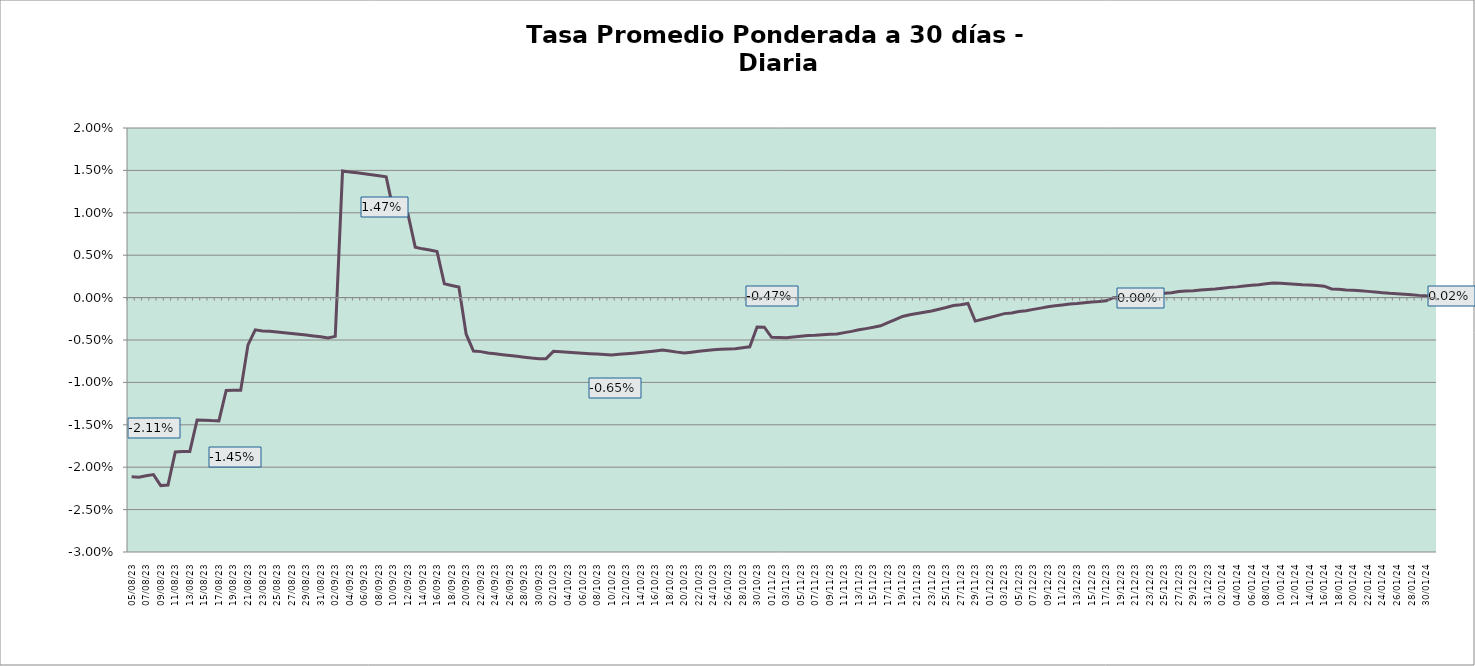
| Category | Tasa a 30 días |
|---|---|
| 2023-08-05 | -0.021 |
| 2023-08-06 | -0.021 |
| 2023-08-07 | -0.021 |
| 2023-08-08 | -0.021 |
| 2023-08-09 | -0.022 |
| 2023-08-10 | -0.022 |
| 2023-08-11 | -0.018 |
| 2023-08-12 | -0.018 |
| 2023-08-13 | -0.018 |
| 2023-08-14 | -0.014 |
| 2023-08-15 | -0.014 |
| 2023-08-16 | -0.015 |
| 2023-08-17 | -0.015 |
| 2023-08-18 | -0.011 |
| 2023-08-19 | -0.011 |
| 2023-08-20 | -0.011 |
| 2023-08-21 | -0.006 |
| 2023-08-22 | -0.004 |
| 2023-08-23 | -0.004 |
| 2023-08-24 | -0.004 |
| 2023-08-25 | -0.004 |
| 2023-08-26 | -0.004 |
| 2023-08-27 | -0.004 |
| 2023-08-28 | -0.004 |
| 2023-08-29 | -0.004 |
| 2023-08-30 | -0.005 |
| 2023-08-31 | -0.005 |
| 2023-09-01 | -0.005 |
| 2023-09-02 | -0.005 |
| 2023-09-03 | 0.015 |
| 2023-09-04 | 0.015 |
| 2023-09-05 | 0.015 |
| 2023-09-06 | 0.015 |
| 2023-09-07 | 0.014 |
| 2023-09-08 | 0.014 |
| 2023-09-09 | 0.014 |
| 2023-09-10 | 0.01 |
| 2023-09-11 | 0.01 |
| 2023-09-12 | 0.01 |
| 2023-09-13 | 0.006 |
| 2023-09-14 | 0.006 |
| 2023-09-15 | 0.006 |
| 2023-09-16 | 0.005 |
| 2023-09-17 | 0.002 |
| 2023-09-18 | 0.001 |
| 2023-09-19 | 0.001 |
| 2023-09-20 | -0.004 |
| 2023-09-21 | -0.006 |
| 2023-09-22 | -0.006 |
| 2023-09-23 | -0.007 |
| 2023-09-24 | -0.007 |
| 2023-09-25 | -0.007 |
| 2023-09-26 | -0.007 |
| 2023-09-27 | -0.007 |
| 2023-09-28 | -0.007 |
| 2023-09-29 | -0.007 |
| 2023-09-30 | -0.007 |
| 2023-10-01 | -0.007 |
| 2023-10-02 | -0.006 |
| 2023-10-03 | -0.006 |
| 2023-10-04 | -0.006 |
| 2023-10-05 | -0.006 |
| 2023-10-06 | -0.007 |
| 2023-10-07 | -0.007 |
| 2023-10-08 | -0.007 |
| 2023-10-09 | -0.007 |
| 2023-10-10 | -0.007 |
| 2023-10-11 | -0.007 |
| 2023-10-12 | -0.007 |
| 2023-10-13 | -0.007 |
| 2023-10-14 | -0.006 |
| 2023-10-15 | -0.006 |
| 2023-10-16 | -0.006 |
| 2023-10-17 | -0.006 |
| 2023-10-18 | -0.006 |
| 2023-10-19 | -0.006 |
| 2023-10-20 | -0.007 |
| 2023-10-21 | -0.006 |
| 2023-10-22 | -0.006 |
| 2023-10-23 | -0.006 |
| 2023-10-24 | -0.006 |
| 2023-10-25 | -0.006 |
| 2023-10-26 | -0.006 |
| 2023-10-27 | -0.006 |
| 2023-10-28 | -0.006 |
| 2023-10-29 | -0.006 |
| 2023-10-30 | -0.003 |
| 2023-10-31 | -0.003 |
| 2023-11-01 | -0.005 |
| 2023-11-02 | -0.005 |
| 2023-11-03 | -0.005 |
| 2023-11-04 | -0.005 |
| 2023-11-05 | -0.005 |
| 2023-11-06 | -0.004 |
| 2023-11-07 | -0.004 |
| 2023-11-08 | -0.004 |
| 2023-11-09 | -0.004 |
| 2023-11-10 | -0.004 |
| 2023-11-11 | -0.004 |
| 2023-11-12 | -0.004 |
| 2023-11-13 | -0.004 |
| 2023-11-14 | -0.004 |
| 2023-11-15 | -0.004 |
| 2023-11-16 | -0.003 |
| 2023-11-17 | -0.003 |
| 2023-11-18 | -0.003 |
| 2023-11-19 | -0.002 |
| 2023-11-20 | -0.002 |
| 2023-11-21 | -0.002 |
| 2023-11-22 | -0.002 |
| 2023-11-23 | -0.002 |
| 2023-11-24 | -0.001 |
| 2023-11-25 | -0.001 |
| 2023-11-26 | -0.001 |
| 2023-11-27 | -0.001 |
| 2023-11-28 | -0.001 |
| 2023-11-29 | -0.003 |
| 2023-11-30 | -0.003 |
| 2023-12-01 | -0.002 |
| 2023-12-02 | -0.002 |
| 2023-12-03 | -0.002 |
| 2023-12-04 | -0.002 |
| 2023-12-05 | -0.002 |
| 2023-12-06 | -0.002 |
| 2023-12-07 | -0.001 |
| 2023-12-08 | -0.001 |
| 2023-12-09 | -0.001 |
| 2023-12-10 | -0.001 |
| 2023-12-11 | -0.001 |
| 2023-12-12 | -0.001 |
| 2023-12-13 | -0.001 |
| 2023-12-14 | -0.001 |
| 2023-12-15 | -0.001 |
| 2023-12-16 | 0 |
| 2023-12-17 | 0 |
| 2023-12-18 | 0 |
| 2023-12-19 | 0 |
| 2023-12-20 | 0 |
| 2023-12-21 | 0 |
| 2023-12-22 | 0 |
| 2023-12-23 | 0 |
| 2023-12-24 | 0 |
| 2023-12-25 | 0.001 |
| 2023-12-26 | 0.001 |
| 2023-12-27 | 0.001 |
| 2023-12-28 | 0.001 |
| 2023-12-29 | 0.001 |
| 2023-12-30 | 0.001 |
| 2023-12-31 | 0.001 |
| 2024-01-01 | 0.001 |
| 2024-01-02 | 0.001 |
| 2024-01-03 | 0.001 |
| 2024-01-04 | 0.001 |
| 2024-01-05 | 0.001 |
| 2024-01-06 | 0.001 |
| 2024-01-07 | 0.002 |
| 2024-01-08 | 0.002 |
| 2024-01-09 | 0.002 |
| 2024-01-10 | 0.002 |
| 2024-01-11 | 0.002 |
| 2024-01-12 | 0.002 |
| 2024-01-13 | 0.002 |
| 2024-01-14 | 0.001 |
| 2024-01-15 | 0.001 |
| 2024-01-16 | 0.001 |
| 2024-01-17 | 0.001 |
| 2024-01-18 | 0.001 |
| 2024-01-19 | 0.001 |
| 2024-01-20 | 0.001 |
| 2024-01-21 | 0.001 |
| 2024-01-22 | 0.001 |
| 2024-01-23 | 0.001 |
| 2024-01-24 | 0.001 |
| 2024-01-25 | 0 |
| 2024-01-26 | 0 |
| 2024-01-27 | 0 |
| 2024-01-28 | 0 |
| 2024-01-29 | 0 |
| 2024-01-30 | 0 |
| 2024-01-31 | 0 |